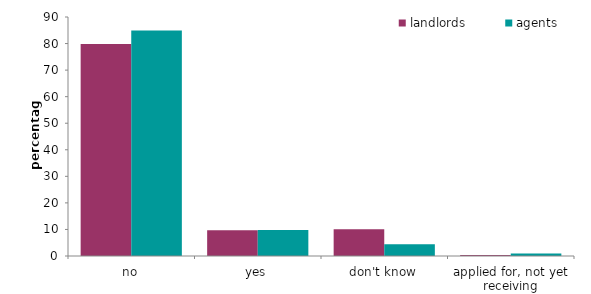
| Category | landlords | agents |
|---|---|---|
| no | 79.871 | 84.915 |
| yes | 9.685 | 9.781 |
| don't know | 10.081 | 4.4 |
| applied for, not yet receiving | 0.363 | 0.909 |